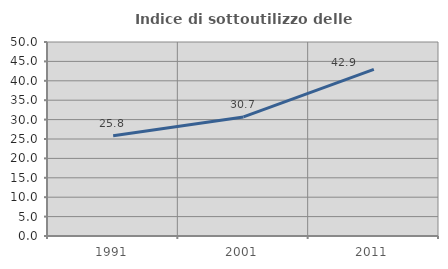
| Category | Indice di sottoutilizzo delle abitazioni  |
|---|---|
| 1991.0 | 25.835 |
| 2001.0 | 30.685 |
| 2011.0 | 42.931 |